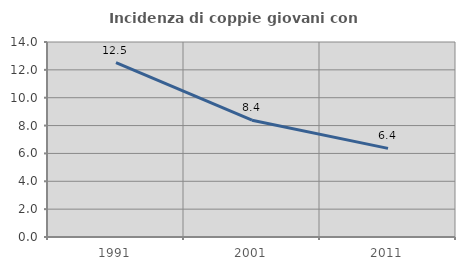
| Category | Incidenza di coppie giovani con figli |
|---|---|
| 1991.0 | 12.525 |
| 2001.0 | 8.387 |
| 2011.0 | 6.364 |